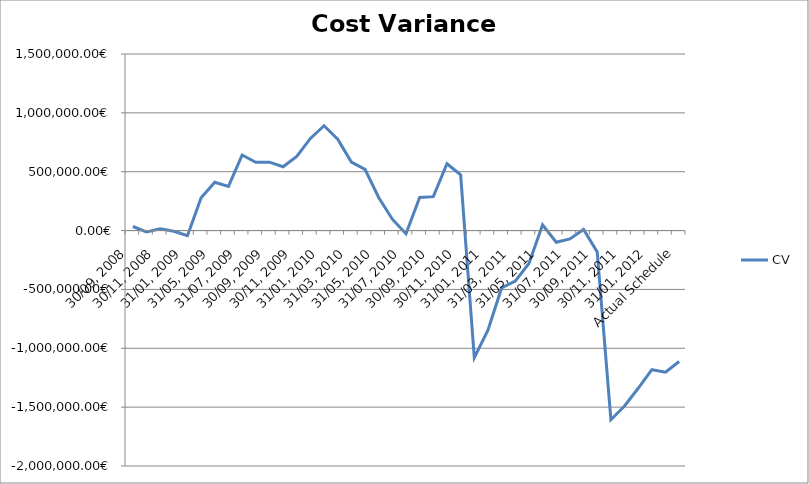
| Category | CV |
|---|---|
| 30/09, 2008 | 34719.035 |
| 31/10, 2008 | -11849.407 |
| 30/11, 2008 | 15675.494 |
| 31/12, 2008 | -5470.258 |
| 31/01, 2009 | -43777 |
| 30/04, 2009 | 278960.004 |
| 31/05, 2009 | 410146.58 |
| 30/06, 2009 | 375946.076 |
| 31/07, 2009 | 641630.139 |
| 31/08, 2009 | 579661.719 |
| 30/09, 2009 | 581392.835 |
| 31/10, 2009 | 541992.442 |
| 30/11, 2009 | 629983.274 |
| 31/12, 2009 | 782772.752 |
| 31/01, 2010 | 890649.507 |
| 28/02, 2010 | 776354.51 |
| 31/03, 2010 | 582139.436 |
| 30/04, 2010 | 520439.899 |
| 31/05, 2010 | 281549.491 |
| 30/06, 2010 | 96682.462 |
| 31/07, 2010 | -27103.945 |
| 31/08, 2010 | 280650.695 |
| 30/09, 2010 | 287890.912 |
| 31/10, 2010 | 567476.646 |
| 30/11, 2010 | 473619.96 |
| 31/12, 2010 | -1079823.432 |
| 31/01, 2011 | -846282.915 |
| 28/02, 2011 | -487168.046 |
| 31/03, 2011 | -429215.836 |
| 30/04, 2011 | -279723.674 |
| 31/05, 2011 | 48484.953 |
| 30/06, 2011 | -99086.803 |
| 31/07, 2011 | -70452.253 |
| 31/08, 2011 | 9047.443 |
| 30/09, 2011 | -182547.286 |
| 31/10, 2011 | -1606714.935 |
| 30/11, 2011 | -1489860.151 |
| 31/12, 2011 | -1339717.833 |
| 31/01, 2012 | -1181612.873 |
| 29/02, 2012 | -1202762.953 |
| Actual Schedule | -1112564.049 |